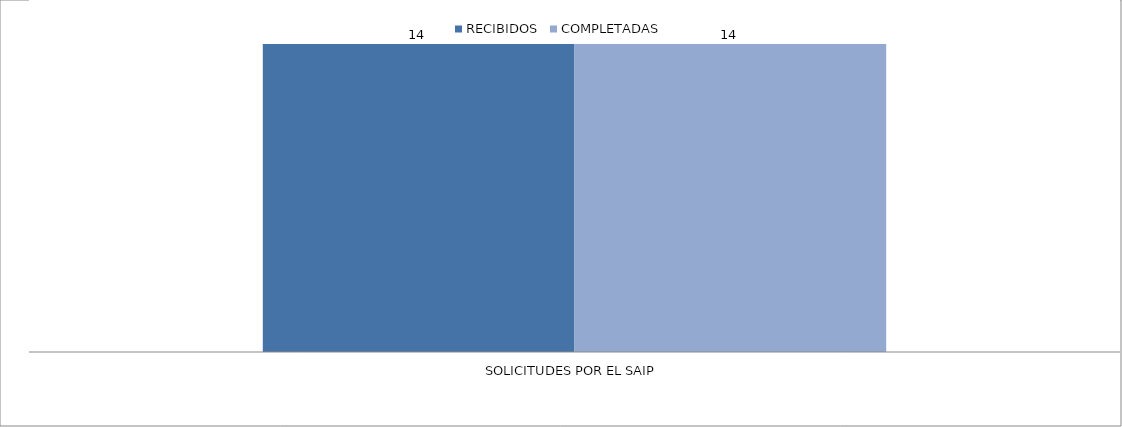
| Category | RECIBIDOS | COMPLETADAS |
|---|---|---|
| SOLICITUDES POR EL SAIP | 14 | 14 |